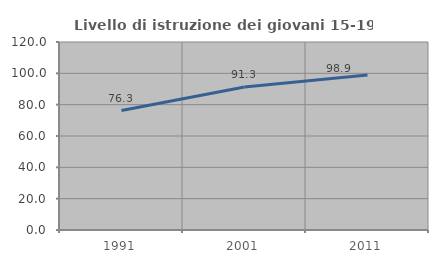
| Category | Livello di istruzione dei giovani 15-19 anni |
|---|---|
| 1991.0 | 76.257 |
| 2001.0 | 91.264 |
| 2011.0 | 98.893 |